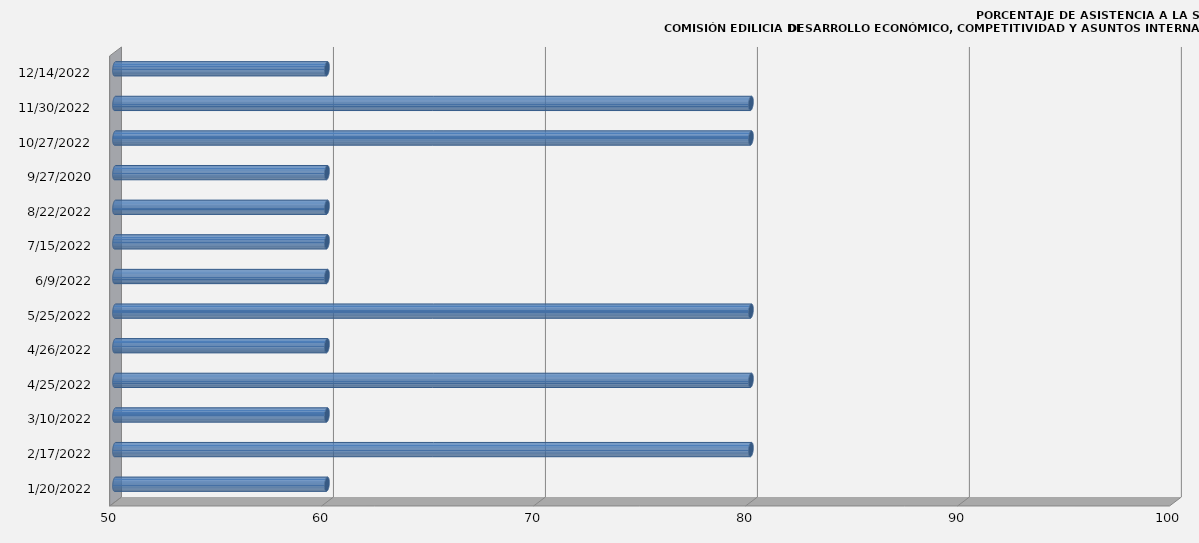
| Category | 20/01/2022 |
|---|---|
| 1/20/22 | 60 |
| 2/17/22 | 80 |
| 3/10/22 | 60 |
| 4/25/22 | 80 |
| 4/26/22 | 60 |
| 5/25/22 | 80 |
| 6/9/22 | 60 |
| 7/15/22 | 60 |
| 8/22/22 | 60 |
| 9/27/20 | 60 |
| 10/27/22 | 80 |
| 11/30/22 | 80 |
| 12/14/22 | 60 |